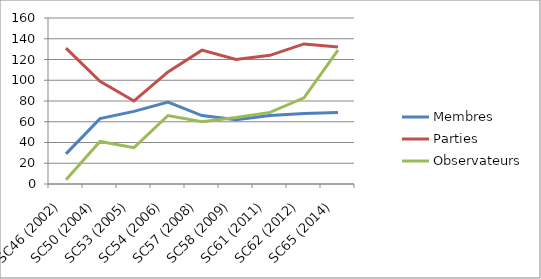
| Category | Membres | Parties | Observateurs |
|---|---|---|---|
| SC46 (2002) | 29 | 131 | 4 |
| SC50 (2004) | 63 | 99 | 41 |
| SC53 (2005) | 70 | 80 | 35 |
| SC54 (2006) | 79 | 108 | 66 |
| SC57 (2008) | 66 | 129 | 60 |
| SC58 (2009) | 62 | 120 | 64 |
| SC61 (2011) | 66 | 124 | 69 |
| SC62 (2012) | 68 | 135 | 83 |
| SC65 (2014) | 69 | 132 | 129 |